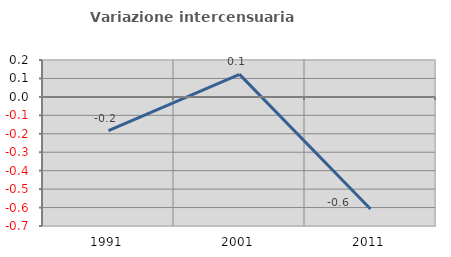
| Category | Variazione intercensuaria annua |
|---|---|
| 1991.0 | -0.182 |
| 2001.0 | 0.122 |
| 2011.0 | -0.608 |